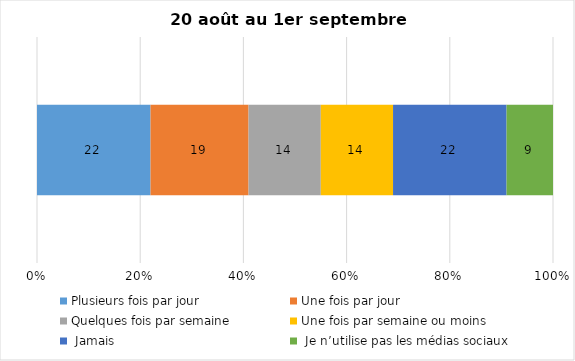
| Category | Plusieurs fois par jour | Une fois par jour | Quelques fois par semaine   | Une fois par semaine ou moins   |  Jamais   |  Je n’utilise pas les médias sociaux |
|---|---|---|---|---|---|---|
| 0 | 22 | 19 | 14 | 14 | 22 | 9 |